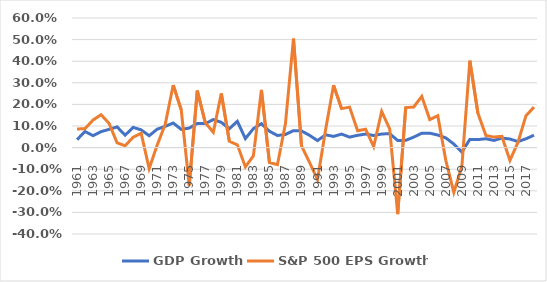
| Category | GDP Growth | S&P 500 EPS Growth |
|---|---|---|
| 1961.0 | 0.037 | 0.086 |
| 1962.0 | 0.074 | 0.088 |
| 1963.0 | 0.055 | 0.128 |
| 1964.0 | 0.074 | 0.152 |
| 1965.0 | 0.084 | 0.112 |
| 1966.0 | 0.096 | 0.022 |
| 1967.0 | 0.057 | 0.008 |
| 1968.0 | 0.094 | 0.048 |
| 1969.0 | 0.082 | 0.067 |
| 1970.0 | 0.055 | -0.097 |
| 1971.0 | 0.085 | 0.012 |
| 1972.0 | 0.098 | 0.108 |
| 1973.0 | 0.114 | 0.289 |
| 1974.0 | 0.084 | 0.175 |
| 1975.0 | 0.09 | -0.175 |
| 1976.0 | 0.112 | 0.264 |
| 1977.0 | 0.111 | 0.115 |
| 1978.0 | 0.13 | 0.071 |
| 1979.0 | 0.117 | 0.251 |
| 1980.0 | 0.088 | 0.029 |
| 1981.0 | 0.122 | 0.013 |
| 1982.0 | 0.042 | -0.09 |
| 1983.0 | 0.088 | -0.038 |
| 1984.0 | 0.111 | 0.267 |
| 1985.0 | 0.076 | -0.069 |
| 1986.0 | 0.056 | -0.079 |
| 1987.0 | 0.061 | 0.111 |
| 1988.0 | 0.079 | 0.504 |
| 1989.0 | 0.077 | 0.008 |
| 1990.0 | 0.057 | -0.069 |
| 1991.0 | 0.033 | -0.148 |
| 1992.0 | 0.059 | 0.081 |
| 1993.0 | 0.052 | 0.289 |
| 1994.0 | 0.063 | 0.18 |
| 1995.0 | 0.049 | 0.187 |
| 1996.0 | 0.057 | 0.078 |
| 1997.0 | 0.063 | 0.085 |
| 1998.0 | 0.056 | 0.004 |
| 1999.0 | 0.063 | 0.167 |
| 2000.0 | 0.065 | 0.086 |
| 2001.0 | 0.033 | -0.308 |
| 2002.0 | 0.033 | 0.185 |
| 2003.0 | 0.049 | 0.188 |
| 2004.0 | 0.066 | 0.238 |
| 2005.0 | 0.067 | 0.13 |
| 2006.0 | 0.058 | 0.147 |
| 2007.0 | 0.045 | -0.059 |
| 2008.0 | 0.017 | -0.208 |
| 2009.0 | -0.02 | -0.088 |
| 2010.0 | 0.038 | 0.403 |
| 2011.0 | 0.037 | 0.16 |
| 2012.0 | 0.041 | 0.056 |
| 2013.0 | 0.033 | 0.049 |
| 2014.0 | 0.044 | 0.052 |
| 2015.0 | 0.04 | -0.059 |
| 2016.0 | 0.028 | 0.024 |
| 2017.0 | 0.041 | 0.148 |
| 2018.0 | 0.057 | 0.187 |